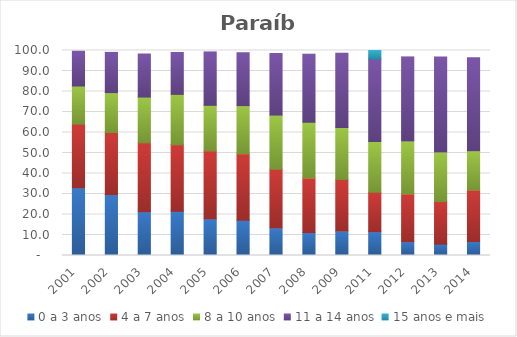
| Category | 0 a 3 anos | 4 a 7 anos | 8 a 10 anos | 11 a 14 anos | 15 anos e mais |
|---|---|---|---|---|---|
| 2001.0 | 33.07 | 31.03 | 18.58 | 16.93 | 0 |
| 2002.0 | 29.72 | 30.28 | 19.44 | 19.63 | 0 |
| 2003.0 | 21.36 | 33.69 | 22.23 | 20.97 | 0 |
| 2004.0 | 21.6 | 32.49 | 24.51 | 20.43 | 0 |
| 2005.0 | 17.93 | 33.19 | 22.15 | 26.04 | 0 |
| 2006.0 | 17.24 | 32.4 | 23.46 | 25.81 | 0 |
| 2007.0 | 13.5 | 28.57 | 26.42 | 30.04 | 0 |
| 2008.0 | 11.18 | 26.67 | 27.1 | 33.23 | 0 |
| 2009.0 | 11.95 | 25.16 | 25.37 | 36.15 | 0 |
| 2011.0 | 11.61 | 19.26 | 24.79 | 40.08 | 4.25 |
| 2012.0 | 6.75 | 23.31 | 25.83 | 40.93 | 0 |
| 2013.0 | 5.52 | 20.83 | 24.14 | 46.35 | 0 |
| 2014.0 | 6.84 | 25.16 | 19.1 | 45.42 | 0 |